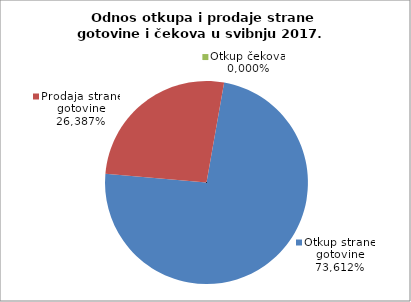
| Category | Otkup strane gotovine |
|---|---|
| 0 | 0.736 |
| 1 | 0.264 |
| 2 | 0 |